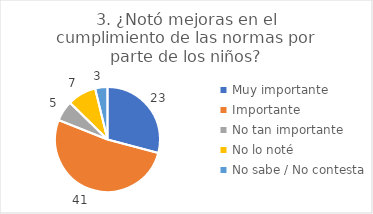
| Category | 3. ¿Notó mejoras en el cumplimiento de las normas por parte de los niños? |
|---|---|
| Muy importante  | 0.291 |
| Importante  | 0.519 |
| No tan importante  | 0.063 |
| No lo noté  | 0.089 |
| No sabe / No contesta | 0.038 |